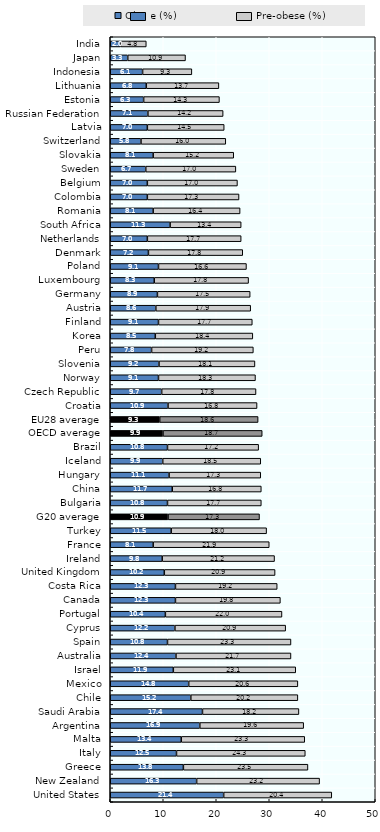
| Category | Obese (%) | Pre-obese (%) |
|---|---|---|
| United States | 21.4 | 20.4 |
| New Zealand | 16.3 | 23.2 |
| Greece | 13.8 | 23.5 |
| Italy | 12.5 | 24.3 |
| Malta | 13.4 | 23.3 |
| Argentina | 16.9 | 19.6 |
| Saudi Arabia | 17.4 | 18.2 |
| Chile | 15.2 | 20.2 |
| Mexico | 14.8 | 20.6 |
| Israel | 11.9 | 23.1 |
| Australia | 12.4 | 21.7 |
| Spain | 10.8 | 23.3 |
| Cyprus | 12.2 | 20.9 |
| Portugal | 10.4 | 22 |
| Canada | 12.3 | 19.8 |
| Costa Rica | 12.3 | 19.2 |
| United Kingdom | 10.2 | 20.9 |
| Ireland | 9.8 | 21.2 |
| France | 8.1 | 21.9 |
| Turkey | 11.5 | 18 |
| G20 average | 10.905 | 17.258 |
| Bulgaria | 10.8 | 17.7 |
| China | 11.7 | 16.8 |
| Hungary | 11.1 | 17.3 |
| Iceland | 9.9 | 18.5 |
| Brazil | 10.8 | 17.2 |
| OECD average | 9.947 | 18.725 |
| EU28 average | 9.325 | 18.575 |
| Croatia | 10.9 | 16.8 |
| Czech Republic | 9.7 | 17.8 |
| Norway | 9.1 | 18.3 |
| Slovenia | 9.2 | 18.1 |
| Peru | 7.8 | 19.2 |
| Korea | 8.5 | 18.4 |
| Finland | 9.1 | 17.7 |
| Austria | 8.6 | 17.9 |
| Germany | 8.9 | 17.5 |
| Luxembourg | 8.3 | 17.8 |
| Poland | 9.1 | 16.6 |
| Denmark | 7.2 | 17.8 |
| Netherlands | 7 | 17.7 |
| South Africa | 11.3 | 13.4 |
| Romania | 8.1 | 16.4 |
| Colombia | 7 | 17.3 |
| Belgium | 7 | 17 |
| Sweden | 6.7 | 17 |
| Slovakia | 8.1 | 15.2 |
| Switzerland | 5.8 | 16 |
| Latvia | 7 | 14.5 |
| Russian Federation | 7.1 | 14.2 |
| Estonia | 6.3 | 14.3 |
| Lithuania | 6.8 | 13.7 |
| Indonesia | 6.1 | 9.3 |
| Japan | 3.3 | 10.9 |
| India | 2 | 4.8 |